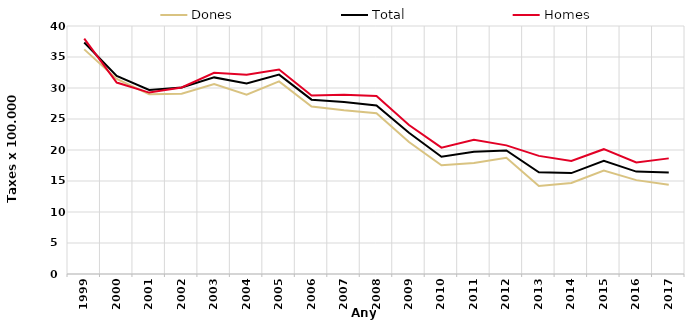
| Category | Dones | Total | Homes |
|---|---|---|---|
| 1999.0 | 36.23 | 37.34 | 37.97 |
| 2000.0 | 31.47 | 31.93 | 30.88 |
| 2001.0 | 29.01 | 29.69 | 29.26 |
| 2002.0 | 29.07 | 30.09 | 30.09 |
| 2003.0 | 30.63 | 31.71 | 32.46 |
| 2004.0 | 28.91 | 30.74 | 32.15 |
| 2005.0 | 31.06 | 32.16 | 32.98 |
| 2006.0 | 27.01 | 28.12 | 28.8 |
| 2007.0 | 26.4 | 27.75 | 28.91 |
| 2008.0 | 25.93 | 27.19 | 28.71 |
| 2009.0 | 21.29 | 22.78 | 24.03 |
| 2010.0 | 17.55 | 18.92 | 20.38 |
| 2011.0 | 17.92 | 19.73 | 21.65 |
| 2012.0 | 18.74 | 19.93 | 20.75 |
| 2013.0 | 14.19 | 16.41 | 19.05 |
| 2014.0 | 14.67 | 16.28 | 18.23 |
| 2015.0 | 16.67 | 18.25 | 20.13 |
| 2016.0 | 15.14 | 16.52 | 18 |
| 2017.0 | 14.38 | 16.39 | 18.65 |